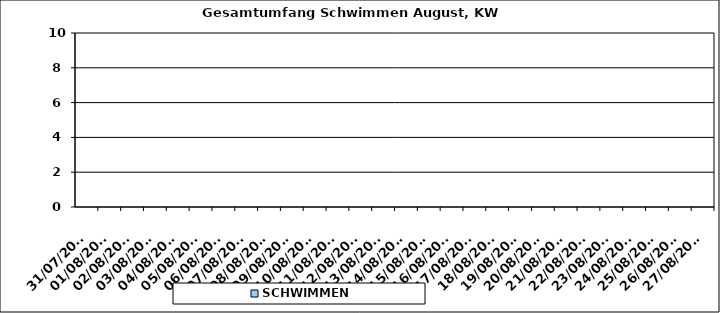
| Category | SCHWIMMEN |
|---|---|
| 31/07/2023 | 0 |
| 01/08/2023 | 0 |
| 02/08/2023 | 0 |
| 03/08/2023 | 0 |
| 04/08/2023 | 0 |
| 05/08/2023 | 0 |
| 06/08/2023 | 0 |
| 07/08/2023 | 0 |
| 08/08/2023 | 0 |
| 09/08/2023 | 0 |
| 10/08/2023 | 0 |
| 11/08/2023 | 0 |
| 12/08/2023 | 0 |
| 13/08/2023 | 0 |
| 14/08/2023 | 0 |
| 15/08/2023 | 0 |
| 16/08/2023 | 0 |
| 17/08/2023 | 0 |
| 18/08/2023 | 0 |
| 19/08/2023 | 0 |
| 20/08/2023 | 0 |
| 21/08/2023 | 0 |
| 22/08/2023 | 0 |
| 23/08/2023 | 0 |
| 24/08/2023 | 0 |
| 25/08/2023 | 0 |
| 26/08/2023 | 0 |
| 27/08/2023 | 0 |